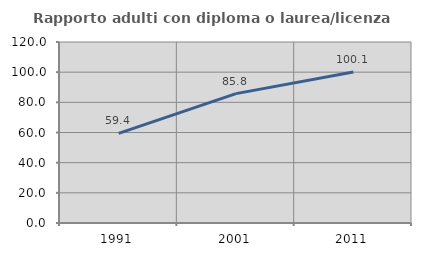
| Category | Rapporto adulti con diploma o laurea/licenza media  |
|---|---|
| 1991.0 | 59.39 |
| 2001.0 | 85.788 |
| 2011.0 | 100.134 |